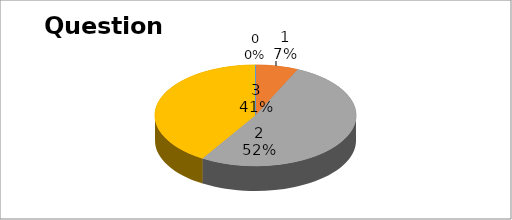
| Category | Series 0 |
|---|---|
| 0 | 0 |
| 1 | 9 |
| 2 | 68 |
| 3 | 54 |